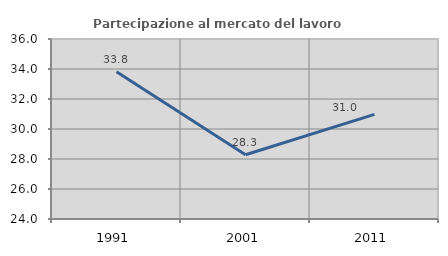
| Category | Partecipazione al mercato del lavoro  femminile |
|---|---|
| 1991.0 | 33.821 |
| 2001.0 | 28.286 |
| 2011.0 | 30.972 |